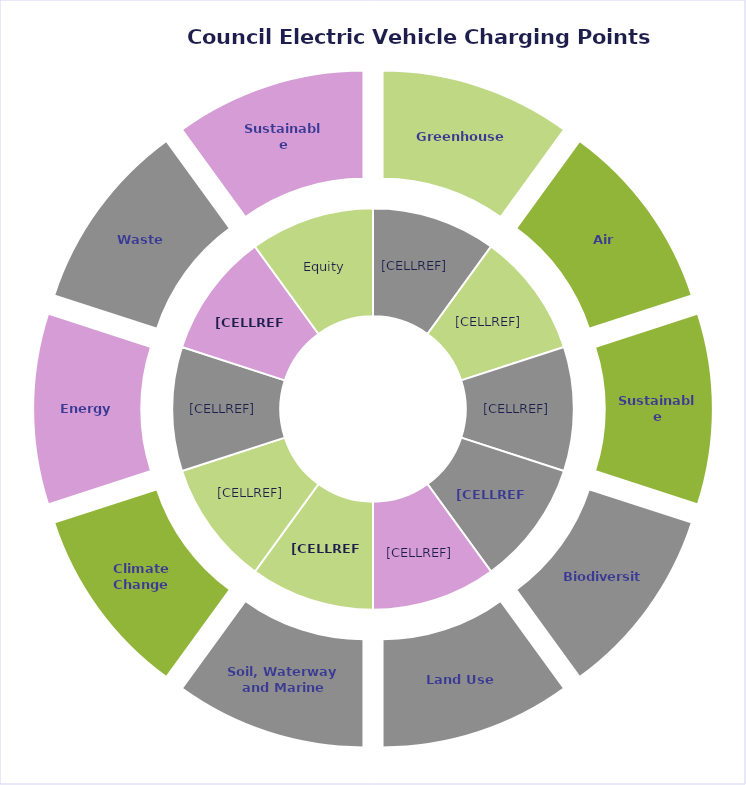
| Category | Series 0 | Social |
|---|---|---|
| Greenhouse Gases | 2 | 2 |
| Air Quality | 2 | 2 |
| Sustainable Transport | 2 | 2 |
| Biodiversity | 2 | 2 |
| Land Use Change | 2 | 2 |
| Soil, Waterway and Marine Health | 2 | 2 |
| Climate Change Adaptation | 2 | 2 |
| Energy Use | 2 | 2 |
| Waste | 2 | 2 |
| Sustainable Materials | 2 | 2 |